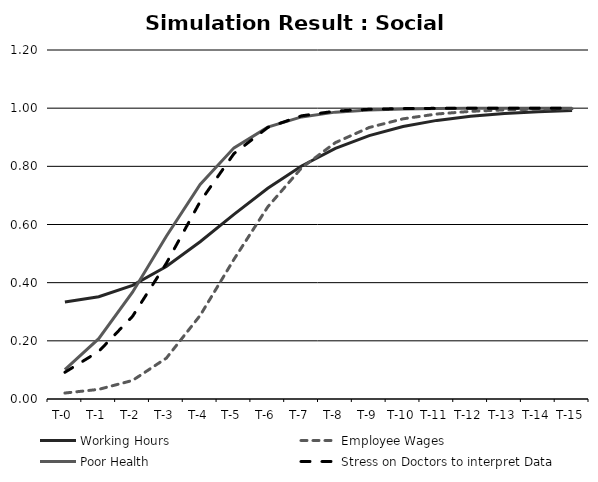
| Category | Working Hours | Employee Wages | Poor Health | Stress on Doctors to interpret Data |
|---|---|---|---|---|
| T-0 | 0.333 | 0.021 | 0.101 | 0.092 |
| T-1 | 0.352 | 0.033 | 0.208 | 0.164 |
| T-2 | 0.391 | 0.064 | 0.367 | 0.284 |
| T-3 | 0.455 | 0.14 | 0.559 | 0.467 |
| T-4 | 0.541 | 0.287 | 0.738 | 0.679 |
| T-5 | 0.635 | 0.48 | 0.864 | 0.844 |
| T-6 | 0.725 | 0.661 | 0.935 | 0.934 |
| T-7 | 0.801 | 0.795 | 0.97 | 0.974 |
| T-8 | 0.861 | 0.882 | 0.986 | 0.99 |
| T-9 | 0.906 | 0.934 | 0.994 | 0.996 |
| T-10 | 0.937 | 0.963 | 0.997 | 0.999 |
| T-11 | 0.958 | 0.98 | 0.999 | 0.999 |
| T-12 | 0.972 | 0.989 | 0.999 | 1 |
| T-13 | 0.982 | 0.994 | 1 | 1 |
| T-14 | 0.988 | 0.997 | 1 | 1 |
| T-15 | 0.992 | 0.998 | 1 | 1 |